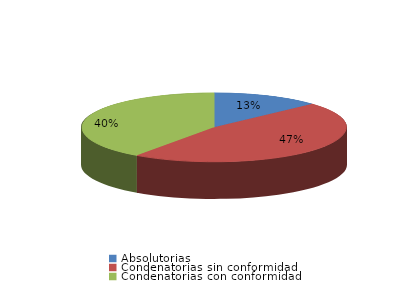
| Category | Series 0 |
|---|---|
| Absolutorias | 16 |
| Condenatorias sin conformidad | 57 |
| Condenatorias con conformidad | 49 |